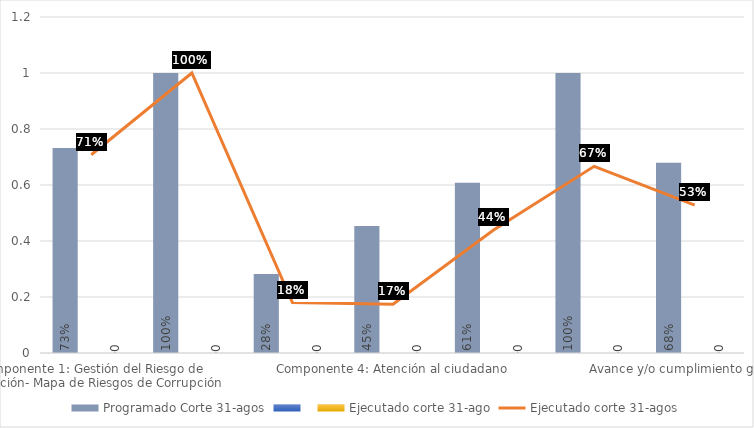
| Category | Programado Corte 31-agos | Componente 1: Gestión del Riesgo de Corrupción- Mapa de Riesgos de Corrupción Componente 2: Estratégia de Racionalización de Trámites | Ejecutado corte 31-ago |
|---|---|---|---|
| Componente 1: Gestión del Riesgo de Corrupción- Mapa de Riesgos de Corrupción | 0.732 |  | 0 |
| Componente 2: Estratégia de Racionalización de Trámites | 1 |  | 0 |
| Componente 3: Rendición de cuentas | 0.283 |  | 0 |
| Componente 4: Atención al ciudadano | 0.453 |  | 0 |
| Componente 5: Transparencia y Acceso de la Información | 0.608 |  | 0 |
| Componente 6: Plan Gestión de la Integridad | 1 |  | 0 |
| Avance y/o cumplimiento general  | 0.679 |  | 0 |